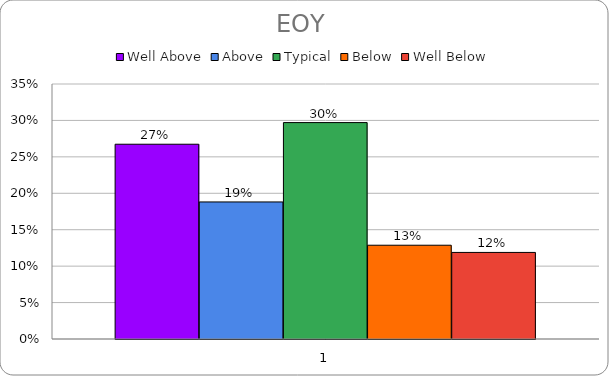
| Category | Well Above | Above | Typical | Below | Well Below |
|---|---|---|---|---|---|
| 0 | 0.267 | 0.188 | 0.297 | 0.129 | 0.119 |